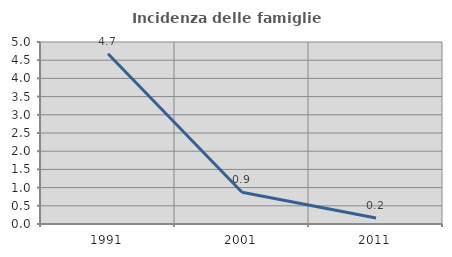
| Category | Incidenza delle famiglie numerose |
|---|---|
| 1991.0 | 4.676 |
| 2001.0 | 0.871 |
| 2011.0 | 0.168 |